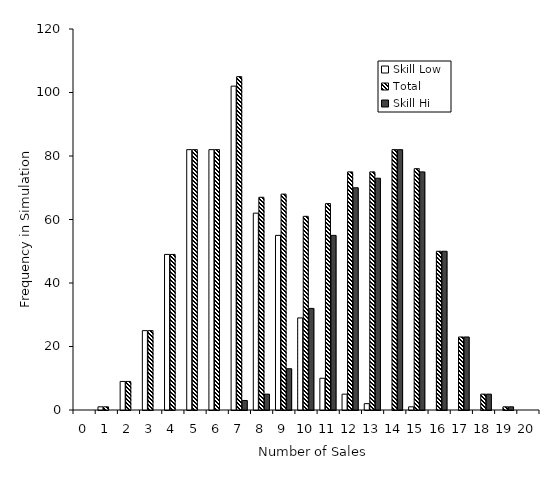
| Category | Skill Low | Total | Skill Hi |
|---|---|---|---|
| 0.0 | 0 | 0 | 0 |
| 1.0 | 1 | 1 | 0 |
| 2.0 | 9 | 9 | 0 |
| 3.0 | 25 | 25 | 0 |
| 4.0 | 49 | 49 | 0 |
| 5.0 | 82 | 82 | 0 |
| 6.0 | 82 | 82 | 0 |
| 7.0 | 102 | 105 | 3 |
| 8.0 | 62 | 67 | 5 |
| 9.0 | 55 | 68 | 13 |
| 10.0 | 29 | 61 | 32 |
| 11.0 | 10 | 65 | 55 |
| 12.0 | 5 | 75 | 70 |
| 13.0 | 2 | 75 | 73 |
| 14.0 | 0 | 82 | 82 |
| 15.0 | 1 | 76 | 75 |
| 16.0 | 0 | 50 | 50 |
| 17.0 | 0 | 23 | 23 |
| 18.0 | 0 | 5 | 5 |
| 19.0 | 0 | 1 | 1 |
| 20.0 | 0 | 0 | 0 |